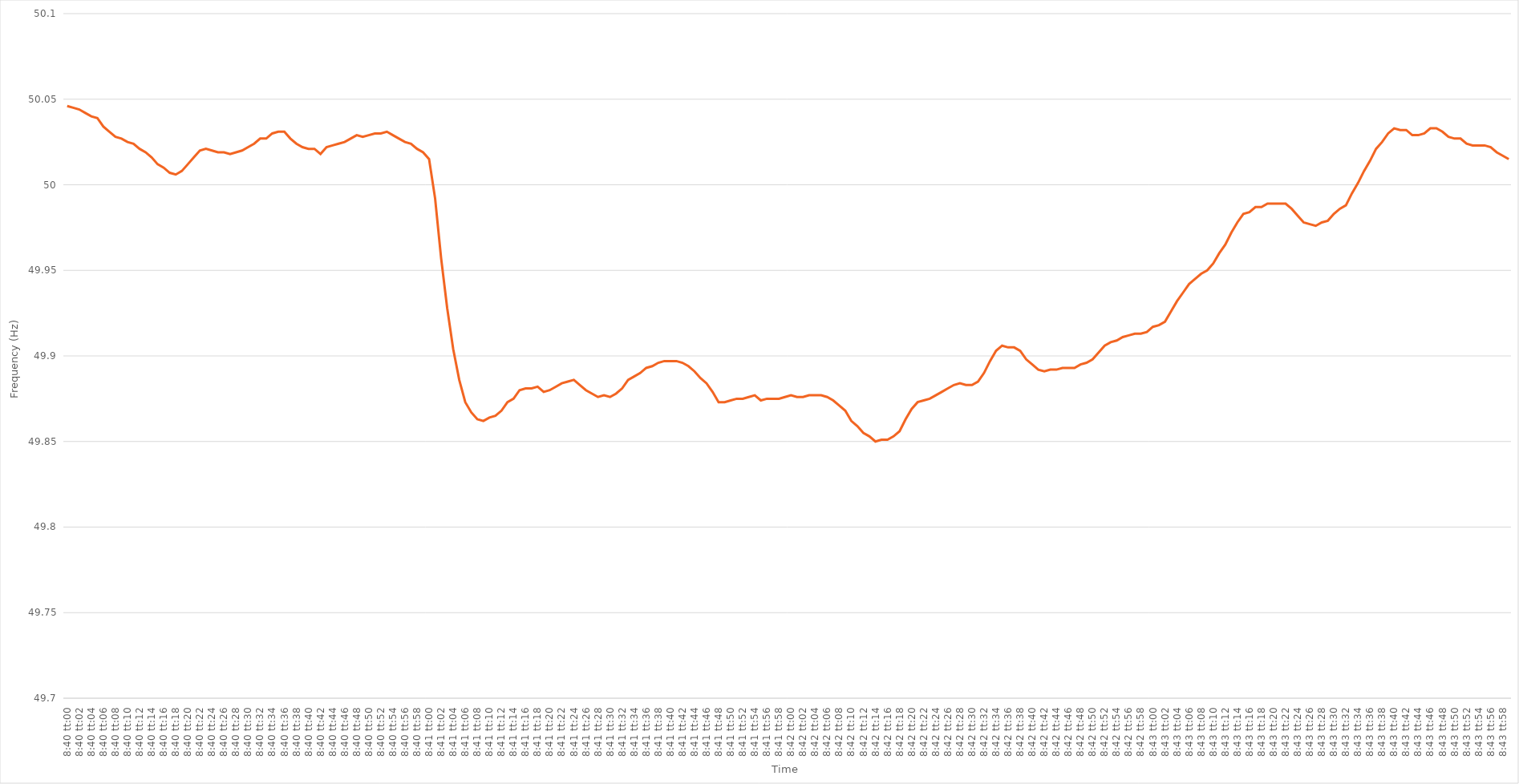
| Category | Series 0 |
|---|---|
| 0.3611111111111111 | 50.046 |
| 0.3611226851851852 | 50.045 |
| 0.36113425925925924 | 50.044 |
| 0.36114583333333333 | 50.042 |
| 0.36115740740740737 | 50.04 |
| 0.3611689814814815 | 50.039 |
| 0.36118055555555556 | 50.034 |
| 0.36119212962962965 | 50.031 |
| 0.3612037037037037 | 50.028 |
| 0.3612152777777778 | 50.027 |
| 0.3612268518518518 | 50.025 |
| 0.361238425925926 | 50.024 |
| 0.36125 | 50.021 |
| 0.3612615740740741 | 50.019 |
| 0.36127314814814815 | 50.016 |
| 0.3612847222222222 | 50.012 |
| 0.3612962962962963 | 50.01 |
| 0.3613078703703703 | 50.007 |
| 0.36131944444444447 | 50.006 |
| 0.3613310185185185 | 50.008 |
| 0.3613425925925926 | 50.012 |
| 0.36135416666666664 | 50.016 |
| 0.36136574074074074 | 50.02 |
| 0.3613773148148148 | 50.021 |
| 0.3613888888888889 | 50.02 |
| 0.36140046296296297 | 50.019 |
| 0.36141203703703706 | 50.019 |
| 0.3614236111111111 | 50.018 |
| 0.3614351851851852 | 50.019 |
| 0.36144675925925923 | 50.02 |
| 0.3614583333333334 | 50.022 |
| 0.3614699074074074 | 50.024 |
| 0.3614814814814815 | 50.027 |
| 0.36149305555555555 | 50.027 |
| 0.36150462962962965 | 50.03 |
| 0.3615162037037037 | 50.031 |
| 0.3615277777777777 | 50.031 |
| 0.3615393518518519 | 50.027 |
| 0.3615509259259259 | 50.024 |
| 0.3615625 | 50.022 |
| 0.36157407407407405 | 50.021 |
| 0.36158564814814814 | 50.021 |
| 0.3615972222222222 | 50.018 |
| 0.36160879629629633 | 50.022 |
| 0.36162037037037037 | 50.023 |
| 0.36163194444444446 | 50.024 |
| 0.3616435185185185 | 50.025 |
| 0.3616550925925926 | 50.027 |
| 0.36166666666666664 | 50.029 |
| 0.3616782407407408 | 50.028 |
| 0.3616898148148148 | 50.029 |
| 0.3617013888888889 | 50.03 |
| 0.36171296296296296 | 50.03 |
| 0.36172453703703705 | 50.031 |
| 0.3617361111111111 | 50.029 |
| 0.36174768518518513 | 50.027 |
| 0.3617592592592593 | 50.025 |
| 0.3617708333333333 | 50.024 |
| 0.3617824074074074 | 50.021 |
| 0.36179398148148145 | 50.019 |
| 0.36180555555555555 | 50.015 |
| 0.3618171296296296 | 49.992 |
| 0.36182870370370374 | 49.957 |
| 0.3618402777777778 | 49.928 |
| 0.36185185185185187 | 49.904 |
| 0.3618634259259259 | 49.886 |
| 0.361875 | 49.873 |
| 0.36188657407407404 | 49.867 |
| 0.3618981481481482 | 49.863 |
| 0.36190972222222223 | 49.862 |
| 0.3619212962962963 | 49.864 |
| 0.36193287037037036 | 49.865 |
| 0.36194444444444446 | 49.868 |
| 0.3619560185185185 | 49.873 |
| 0.36196759259259265 | 49.875 |
| 0.3619791666666667 | 49.88 |
| 0.3619907407407407 | 49.881 |
| 0.3620023148148148 | 49.881 |
| 0.36201388888888886 | 49.882 |
| 0.36202546296296295 | 49.879 |
| 0.362037037037037 | 49.88 |
| 0.36204861111111114 | 49.882 |
| 0.3620601851851852 | 49.884 |
| 0.3620717592592593 | 49.885 |
| 0.3620833333333333 | 49.886 |
| 0.3620949074074074 | 49.883 |
| 0.36210648148148145 | 49.88 |
| 0.3621180555555556 | 49.878 |
| 0.36212962962962963 | 49.876 |
| 0.36214120370370373 | 49.877 |
| 0.36215277777777777 | 49.876 |
| 0.36216435185185186 | 49.878 |
| 0.3621759259259259 | 49.881 |
| 0.36218750000000005 | 49.886 |
| 0.3621990740740741 | 49.888 |
| 0.3622106481481482 | 49.89 |
| 0.3622222222222222 | 49.893 |
| 0.36223379629629626 | 49.894 |
| 0.36224537037037036 | 49.896 |
| 0.3622569444444444 | 49.897 |
| 0.36226851851851855 | 49.897 |
| 0.3622800925925926 | 49.897 |
| 0.3622916666666667 | 49.896 |
| 0.3623032407407407 | 49.894 |
| 0.3623148148148148 | 49.891 |
| 0.36232638888888885 | 49.887 |
| 0.362337962962963 | 49.884 |
| 0.36234953703703704 | 49.879 |
| 0.36236111111111113 | 49.873 |
| 0.3623726851851852 | 49.873 |
| 0.36238425925925927 | 49.874 |
| 0.3623958333333333 | 49.875 |
| 0.36240740740740746 | 49.875 |
| 0.3624189814814815 | 49.876 |
| 0.3624305555555556 | 49.877 |
| 0.36244212962962963 | 49.874 |
| 0.36245370370370367 | 49.875 |
| 0.36246527777777776 | 49.875 |
| 0.3624768518518518 | 49.875 |
| 0.36248842592592595 | 49.876 |
| 0.3625 | 49.877 |
| 0.3625115740740741 | 49.876 |
| 0.3625231481481481 | 49.876 |
| 0.3625347222222222 | 49.877 |
| 0.36254629629629626 | 49.877 |
| 0.3625578703703704 | 49.877 |
| 0.36256944444444444 | 49.876 |
| 0.36258101851851854 | 49.874 |
| 0.3625925925925926 | 49.871 |
| 0.36260416666666667 | 49.868 |
| 0.3626157407407407 | 49.862 |
| 0.36262731481481486 | 49.859 |
| 0.3626388888888889 | 49.855 |
| 0.362650462962963 | 49.853 |
| 0.36266203703703703 | 49.85 |
| 0.3626736111111111 | 49.851 |
| 0.36268518518518517 | 49.851 |
| 0.3626967592592592 | 49.853 |
| 0.36270833333333335 | 49.856 |
| 0.3627199074074074 | 49.863 |
| 0.3627314814814815 | 49.869 |
| 0.3627430555555555 | 49.873 |
| 0.3627546296296296 | 49.874 |
| 0.36276620370370366 | 49.875 |
| 0.3627777777777778 | 49.877 |
| 0.36278935185185185 | 49.879 |
| 0.36280092592592594 | 49.881 |
| 0.3628125 | 49.883 |
| 0.3628240740740741 | 49.884 |
| 0.3628356481481481 | 49.883 |
| 0.36284722222222227 | 49.883 |
| 0.3628587962962963 | 49.885 |
| 0.3628703703703704 | 49.89 |
| 0.36288194444444444 | 49.897 |
| 0.36289351851851853 | 49.903 |
| 0.36290509259259257 | 49.906 |
| 0.3629166666666667 | 49.905 |
| 0.36292824074074076 | 49.905 |
| 0.3629398148148148 | 49.903 |
| 0.3629513888888889 | 49.898 |
| 0.36296296296296293 | 49.895 |
| 0.362974537037037 | 49.892 |
| 0.36298611111111106 | 49.891 |
| 0.3629976851851852 | 49.892 |
| 0.36300925925925925 | 49.892 |
| 0.36302083333333335 | 49.893 |
| 0.3630324074074074 | 49.893 |
| 0.3630439814814815 | 49.893 |
| 0.3630555555555555 | 49.895 |
| 0.36306712962962967 | 49.896 |
| 0.3630787037037037 | 49.898 |
| 0.3630902777777778 | 49.902 |
| 0.36310185185185184 | 49.906 |
| 0.36311342592592594 | 49.908 |
| 0.363125 | 49.909 |
| 0.3631365740740741 | 49.911 |
| 0.36314814814814816 | 49.912 |
| 0.36315972222222226 | 49.913 |
| 0.3631712962962963 | 49.913 |
| 0.36318287037037034 | 49.914 |
| 0.36319444444444443 | 49.917 |
| 0.36320601851851847 | 49.918 |
| 0.3632175925925926 | 49.92 |
| 0.36322916666666666 | 49.926 |
| 0.36324074074074075 | 49.932 |
| 0.3632523148148148 | 49.937 |
| 0.3632638888888889 | 49.942 |
| 0.3632754629629629 | 49.945 |
| 0.3632870370370371 | 49.948 |
| 0.3632986111111111 | 49.95 |
| 0.3633101851851852 | 49.954 |
| 0.36332175925925925 | 49.96 |
| 0.36333333333333334 | 49.965 |
| 0.3633449074074074 | 49.972 |
| 0.36335648148148153 | 49.978 |
| 0.36336805555555557 | 49.983 |
| 0.36337962962962966 | 49.984 |
| 0.3633912037037037 | 49.987 |
| 0.36340277777777774 | 49.987 |
| 0.36341435185185184 | 49.989 |
| 0.3634259259259259 | 49.989 |
| 0.3634375 | 49.989 |
| 0.36344907407407406 | 49.989 |
| 0.36346064814814816 | 49.986 |
| 0.3634722222222222 | 49.982 |
| 0.3634837962962963 | 49.978 |
| 0.36349537037037033 | 49.977 |
| 0.3635069444444445 | 49.976 |
| 0.3635185185185185 | 49.978 |
| 0.3635300925925926 | 49.979 |
| 0.36354166666666665 | 49.983 |
| 0.36355324074074075 | 49.986 |
| 0.3635648148148148 | 49.988 |
| 0.36357638888888894 | 49.995 |
| 0.363587962962963 | 50.001 |
| 0.36359953703703707 | 50.008 |
| 0.3636111111111111 | 50.014 |
| 0.3636226851851852 | 50.021 |
| 0.36363425925925924 | 50.025 |
| 0.3636458333333333 | 50.03 |
| 0.36365740740740743 | 50.033 |
| 0.36366898148148147 | 50.032 |
| 0.36368055555555556 | 50.032 |
| 0.3636921296296296 | 50.029 |
| 0.3637037037037037 | 50.029 |
| 0.36371527777777773 | 50.03 |
| 0.3637268518518519 | 50.033 |
| 0.3637384259259259 | 50.033 |
| 0.36375 | 50.031 |
| 0.36376157407407406 | 50.028 |
| 0.36377314814814815 | 50.027 |
| 0.3637847222222222 | 50.027 |
| 0.36379629629629634 | 50.024 |
| 0.3638078703703704 | 50.023 |
| 0.3638194444444445 | 50.023 |
| 0.3638310185185185 | 50.023 |
| 0.3638425925925926 | 50.022 |
| 0.36385416666666665 | 50.019 |
| 0.3638657407407408 | 50.017 |
| 0.36387731481481483 | 50.015 |